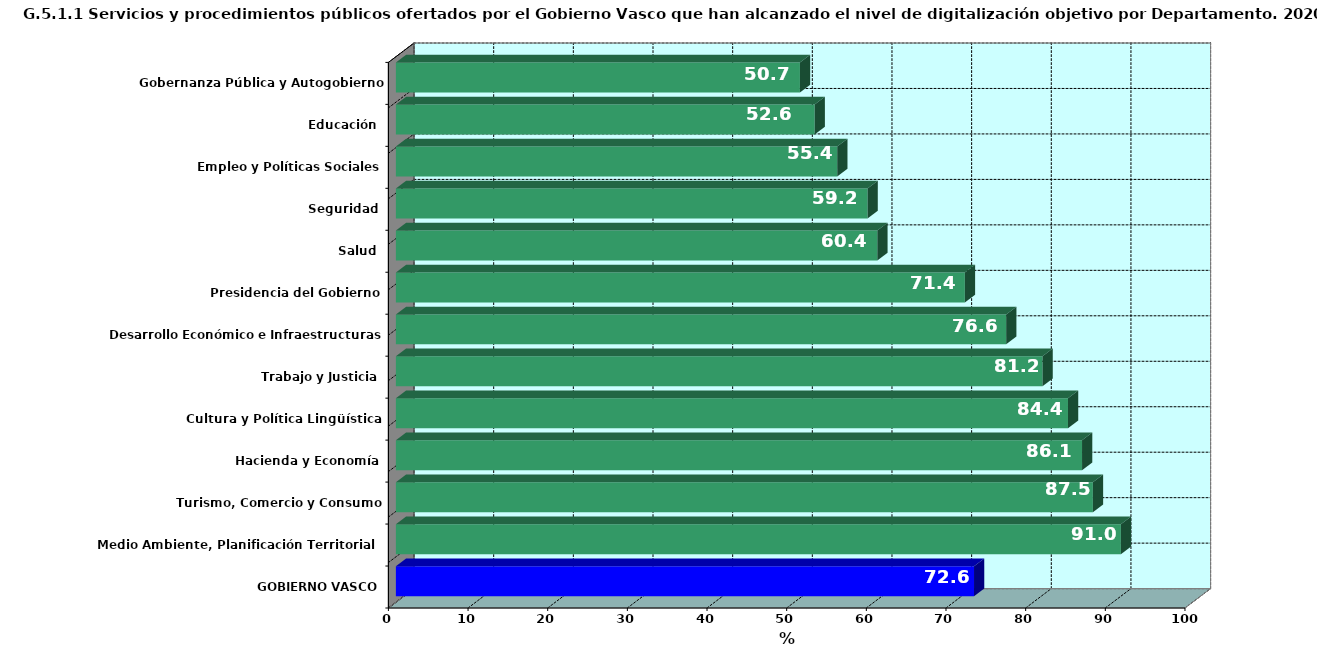
| Category | Series 0 |
|---|---|
| GOBIERNO VASCO | 72.578 |
| Medio Ambiente, Planificación Territorial y Vivienda | 91.016 |
| Turismo, Comercio y Consumo | 87.5 |
| Hacienda y Economía | 86.139 |
| Cultura y Política Lingüística | 84.375 |
| Trabajo y Justicia | 81.176 |
| Desarrollo Económico e Infraestructuras | 76.613 |
| Presidencia del Gobierno | 71.429 |
| Salud | 60.44 |
| Seguridad | 59.211 |
| Empleo y Políticas Sociales | 55.405 |
| Educación | 52.571 |
| Gobernanza Pública y Autogobierno | 50.725 |